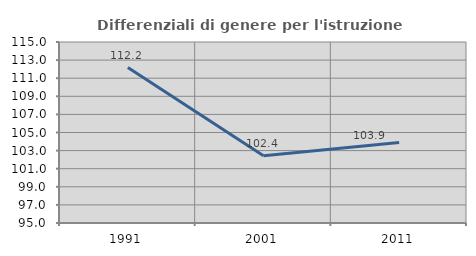
| Category | Differenziali di genere per l'istruzione superiore |
|---|---|
| 1991.0 | 112.173 |
| 2001.0 | 102.419 |
| 2011.0 | 103.9 |